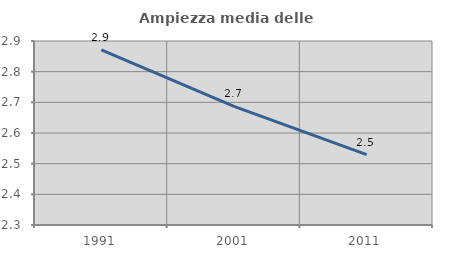
| Category | Ampiezza media delle famiglie |
|---|---|
| 1991.0 | 2.871 |
| 2001.0 | 2.687 |
| 2011.0 | 2.53 |